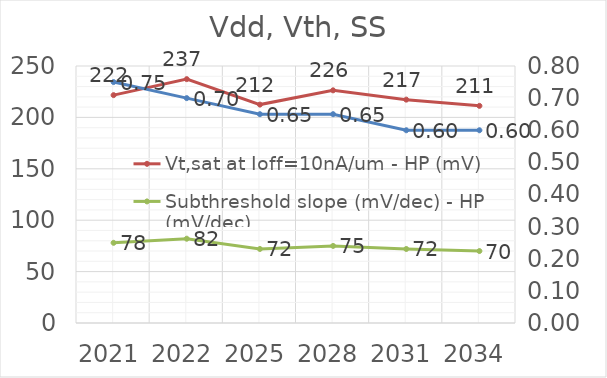
| Category | Vt,sat at Ioff=10nA/um - HP (mV) | Subthreshold slope (mV/dec) - HP (mV/dec) |
|---|---|---|
| 2021.0 | 221.648 | 78 |
| 2022.0 | 237.209 | 82 |
| 2025.0 | 212.456 | 72 |
| 2028.0 | 226.33 | 75 |
| 2031.0 | 217.276 | 72 |
| 2034.0 | 211.241 | 70 |